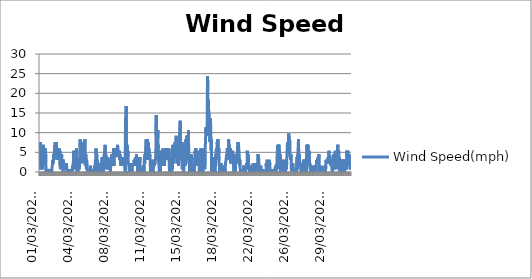
| Category | Wind Speed(mph) |
|---|---|
|  01/03/2022 00:20:09 | 5.4 |
|  01/03/2022 00:50:09 | 7.6 |
|  01/03/2022 01:20:09 | 0.7 |
|  01/03/2022 01:50:09 | 0.7 |
|  01/03/2022 02:20:09 | 3.1 |
|  01/03/2022 02:50:09 | 3.1 |
|  01/03/2022 03:20:09 | 3.8 |
|  01/03/2022 03:50:09 | 0.7 |
|  01/03/2022 04:20:09 | 1.6 |
|  01/03/2022 04:50:09 | 3.1 |
|  01/03/2022 05:20:09 | 3.8 |
|  01/03/2022 05:50:09 | 2.2 |
|  01/03/2022 06:20:09 | 0.7 |
|  01/03/2022 06:50:09 | 3.1 |
|  01/03/2022 07:20:09 | 5.4 |
|  01/03/2022 07:50:09 | 5.4 |
|  01/03/2022 08:20:09 | 6.9 |
|  01/03/2022 08:50:09 | 2.2 |
|  01/03/2022 09:20:09 | 5.4 |
|  01/03/2022 09:50:09 | 4.5 |
|  01/03/2022 10:20:09 | 5.4 |
|  01/03/2022 10:50:09 | 6 |
|  01/03/2022 11:20:09 | 3.8 |
|  01/03/2022 11:50:09 | 6 |
|  01/03/2022 12:20:09 | 3.8 |
|  01/03/2022 12:50:09 | 3.8 |
|  01/03/2022 15:54:06 | 5.4 |
|  01/03/2022 16:24:06 | 2.2 |
|  01/03/2022 16:54:06 | 0.7 |
|  01/03/2022 17:24:06 | 0 |
|  01/03/2022 17:54:06 | 0.7 |
|  01/03/2022 18:24:06 | 0 |
|  01/03/2022 18:54:06 | 0 |
|  01/03/2022 19:24:06 | 0 |
|  01/03/2022 19:54:06 | 0 |
|  01/03/2022 20:24:06 | 0 |
|  01/03/2022 20:54:06 | 0 |
|  01/03/2022 21:24:06 | 0 |
|  01/03/2022 21:54:06 | 0 |
|  01/03/2022 22:24:06 | 0 |
|  01/03/2022 22:54:06 | 0 |
|  01/03/2022 23:24:06 | 0.7 |
|  01/03/2022 23:54:06 | 0 |
|  02/03/2022 00:24:06 | 0 |
|  02/03/2022 00:54:06 | 0 |
|  02/03/2022 01:24:06 | 0 |
|  02/03/2022 01:54:06 | 0 |
|  02/03/2022 02:24:06 | 0.7 |
|  02/03/2022 02:54:06 | 0 |
|  02/03/2022 03:24:06 | 0 |
|  02/03/2022 03:54:06 | 0 |
|  02/03/2022 04:24:06 | 0 |
|  02/03/2022 04:54:06 | 0 |
|  02/03/2022 05:24:06 | 0.7 |
|  02/03/2022 05:54:06 | 0 |
|  02/03/2022 06:24:06 | 0 |
|  02/03/2022 06:54:06 | 0.7 |
|  02/03/2022 07:24:06 | 0.7 |
|  02/03/2022 07:54:06 | 1.6 |
|  02/03/2022 08:24:06 | 1.6 |
|  02/03/2022 08:54:06 | 1.6 |
|  02/03/2022 09:24:06 | 3.1 |
|  02/03/2022 09:54:06 | 2.2 |
|  02/03/2022 10:24:06 | 2.2 |
|  02/03/2022 10:54:06 | 2.2 |
|  02/03/2022 11:24:06 | 4.5 |
|  02/03/2022 11:54:06 | 3.1 |
|  02/03/2022 12:24:06 | 4.5 |
|  02/03/2022 12:54:06 | 4.5 |
|  02/03/2022 13:24:06 | 4.5 |
|  02/03/2022 13:54:06 | 6.9 |
|  02/03/2022 14:24:06 | 4.5 |
|  02/03/2022 14:54:06 | 7.6 |
|  02/03/2022 15:24:06 | 6.9 |
|  02/03/2022 15:54:06 | 6 |
|  02/03/2022 16:24:06 | 5.4 |
|  02/03/2022 16:54:06 | 3.8 |
|  02/03/2022 17:24:06 | 7.6 |
|  02/03/2022 17:54:06 | 6 |
|  02/03/2022 18:24:06 | 6 |
|  02/03/2022 18:54:06 | 4.5 |
|  02/03/2022 19:24:06 | 3.8 |
|  02/03/2022 19:54:06 | 6 |
|  02/03/2022 20:24:06 | 4.5 |
|  02/03/2022 20:54:06 | 3.1 |
|  02/03/2022 21:24:06 | 3.1 |
|  02/03/2022 21:54:06 | 3.8 |
|  02/03/2022 22:24:06 | 3.1 |
|  02/03/2022 22:54:06 | 6 |
|  02/03/2022 23:24:06 | 5.4 |
|  02/03/2022 23:54:06 | 6 |
|  03/03/2022 00:24:06 | 4.5 |
|  03/03/2022 00:54:06 | 3.1 |
|  03/03/2022 01:24:06 | 4.5 |
|  03/03/2022 01:54:06 | 5.4 |
|  03/03/2022 02:24:06 | 1.6 |
|  03/03/2022 02:54:06 | 1.6 |
|  03/03/2022 03:24:06 | 0.7 |
|  03/03/2022 03:54:06 | 1.6 |
|  03/03/2022 04:24:06 | 3.1 |
|  03/03/2022 04:54:06 | 1.6 |
|  03/03/2022 05:24:06 | 2.2 |
|  03/03/2022 05:54:06 | 4.5 |
|  03/03/2022 06:24:06 | 3.8 |
|  03/03/2022 06:54:06 | 1.6 |
|  03/03/2022 07:24:06 | 3.1 |
|  03/03/2022 07:54:06 | 1.6 |
|  03/03/2022 08:24:06 | 1.6 |
|  03/03/2022 08:54:06 | 1.6 |
|  03/03/2022 09:24:06 | 0.7 |
|  03/03/2022 09:54:06 | 0 |
|  03/03/2022 10:24:06 | 3.1 |
|  03/03/2022 10:54:06 | 2.2 |
|  03/03/2022 11:24:06 | 1.6 |
|  03/03/2022 11:54:06 | 2.2 |
|  03/03/2022 12:24:06 | 1.6 |
|  03/03/2022 12:54:06 | 0.7 |
|  03/03/2022 13:24:06 | 0.7 |
|  03/03/2022 13:54:06 | 2.2 |
|  03/03/2022 14:24:06 | 2.2 |
|  03/03/2022 14:54:06 | 2.2 |
|  03/03/2022 15:24:06 | 0.7 |
|  03/03/2022 15:54:06 | 1.6 |
|  03/03/2022 16:24:06 | 2.2 |
|  03/03/2022 16:54:06 | 0.7 |
|  03/03/2022 17:24:06 | 2.2 |
|  03/03/2022 17:54:06 | 1.6 |
|  03/03/2022 18:24:06 | 0 |
|  03/03/2022 18:54:06 | 0 |
|  03/03/2022 19:24:06 | 0 |
|  03/03/2022 19:54:06 | 0 |
|  03/03/2022 20:24:06 | 0 |
|  03/03/2022 20:54:06 | 0 |
|  03/03/2022 21:24:06 | 0 |
|  03/03/2022 21:54:06 | 0 |
|  03/03/2022 22:24:06 | 0 |
|  03/03/2022 22:54:06 | 0 |
|  03/03/2022 23:24:06 | 0 |
|  03/03/2022 23:54:06 | 0 |
|  04/03/2022 00:24:06 | 0 |
|  04/03/2022 00:54:06 | 0.7 |
|  04/03/2022 01:24:06 | 0.7 |
|  04/03/2022 01:54:06 | 0.7 |
|  04/03/2022 02:24:06 | 0 |
|  04/03/2022 02:54:06 | 0 |
|  04/03/2022 03:24:06 | 0 |
|  04/03/2022 03:54:06 | 0 |
|  04/03/2022 04:24:06 | 0.7 |
|  04/03/2022 04:54:06 | 0 |
|  04/03/2022 05:24:06 | 0 |
|  04/03/2022 05:54:06 | 0 |
|  04/03/2022 06:24:06 | 0 |
|  04/03/2022 06:54:06 | 0 |
|  04/03/2022 07:24:06 | 0.7 |
|  04/03/2022 07:54:06 | 0 |
|  04/03/2022 08:24:06 | 1.6 |
|  04/03/2022 08:54:06 | 0.7 |
|  04/03/2022 09:24:06 | 0.7 |
|  04/03/2022 09:54:06 | 2.2 |
|  04/03/2022 10:24:06 | 5.4 |
|  04/03/2022 10:54:06 | 5.4 |
|  04/03/2022 11:24:06 | 4.5 |
|  04/03/2022 11:54:06 | 3.8 |
|  04/03/2022 12:24:06 | 4.5 |
|  04/03/2022 12:54:06 | 1.6 |
|  04/03/2022 13:24:06 | 4.5 |
|  04/03/2022 13:54:06 | 3.1 |
|  04/03/2022 14:24:06 | 0.7 |
|  04/03/2022 14:54:06 | 0.7 |
|  04/03/2022 15:24:06 | 3.8 |
|  04/03/2022 15:54:06 | 5.4 |
|  04/03/2022 16:24:06 | 3.1 |
|  04/03/2022 16:54:06 | 1.6 |
|  04/03/2022 17:24:06 | 6 |
|  04/03/2022 17:54:06 | 0.7 |
|  04/03/2022 18:24:06 | 1.6 |
|  04/03/2022 18:54:06 | 0 |
|  04/03/2022 19:24:06 | 0 |
|  04/03/2022 19:54:06 | 0 |
|  04/03/2022 20:24:06 | 0 |
|  04/03/2022 20:54:06 | 0 |
|  04/03/2022 21:24:06 | 0 |
|  04/03/2022 21:54:06 | 0 |
|  04/03/2022 22:24:06 | 3.8 |
|  04/03/2022 22:54:06 | 1.6 |
|  04/03/2022 23:24:06 | 3.1 |
|  04/03/2022 23:54:06 | 0.7 |
|  05/03/2022 00:24:06 | 0.7 |
|  05/03/2022 00:54:06 | 2.2 |
|  05/03/2022 01:24:06 | 5.4 |
|  05/03/2022 01:54:06 | 6.9 |
|  05/03/2022 02:24:06 | 8.3 |
|  05/03/2022 02:54:06 | 3.8 |
|  05/03/2022 03:24:06 | 3.8 |
|  05/03/2022 03:54:06 | 3.8 |
|  05/03/2022 04:24:06 | 3.8 |
|  05/03/2022 04:54:06 | 6.9 |
|  05/03/2022 05:24:06 | 5.4 |
|  05/03/2022 05:54:06 | 6 |
|  05/03/2022 06:24:06 | 3.1 |
|  05/03/2022 06:54:06 | 2.2 |
|  05/03/2022 07:24:06 | 3.8 |
|  05/03/2022 07:54:06 | 3.1 |
|  05/03/2022 08:24:06 | 7.6 |
|  05/03/2022 08:54:06 | 6.9 |
|  05/03/2022 09:24:06 | 6 |
|  05/03/2022 09:54:06 | 6 |
|  05/03/2022 10:24:06 | 3.8 |
|  05/03/2022 10:54:06 | 6.9 |
|  05/03/2022 11:24:06 | 3.1 |
|  05/03/2022 11:54:06 | 7.6 |
|  05/03/2022 12:24:06 | 6.9 |
|  05/03/2022 12:54:06 | 7.6 |
|  05/03/2022 13:24:06 | 8.3 |
|  05/03/2022 13:54:06 | 3.8 |
|  05/03/2022 14:24:06 | 1.6 |
|  05/03/2022 14:54:06 | 2.2 |
|  05/03/2022 15:24:06 | 4.5 |
|  05/03/2022 15:54:06 | 3.1 |
|  05/03/2022 16:24:06 | 2.2 |
|  05/03/2022 16:54:06 | 0.7 |
|  05/03/2022 17:24:06 | 3.1 |
|  05/03/2022 17:54:06 | 3.1 |
|  05/03/2022 18:24:06 | 1.6 |
|  05/03/2022 18:54:06 | 0.7 |
|  05/03/2022 19:24:06 | 0.7 |
|  05/03/2022 19:54:06 | 0 |
|  05/03/2022 20:24:06 | 0 |
|  05/03/2022 20:54:06 | 0 |
|  05/03/2022 21:24:06 | 0.7 |
|  05/03/2022 21:54:06 | 0 |
|  05/03/2022 22:24:06 | 0.7 |
|  05/03/2022 22:54:06 | 0.7 |
|  05/03/2022 23:24:06 | 0 |
|  05/03/2022 23:54:06 | 0.7 |
|  06/03/2022 00:24:06 | 0.7 |
|  06/03/2022 00:54:06 | 0 |
|  06/03/2022 01:24:06 | 0.7 |
|  06/03/2022 01:54:06 | 0 |
|  06/03/2022 02:24:06 | 1.6 |
|  06/03/2022 02:54:06 | 0.7 |
|  06/03/2022 03:24:06 | 0 |
|  06/03/2022 03:54:06 | 0 |
|  06/03/2022 04:24:06 | 0 |
|  06/03/2022 04:54:06 | 0 |
|  06/03/2022 05:24:06 | 0 |
|  06/03/2022 05:54:06 | 0 |
|  06/03/2022 06:24:06 | 0 |
|  06/03/2022 06:54:06 | 0 |
|  06/03/2022 07:24:06 | 0 |
|  06/03/2022 07:54:06 | 0 |
|  06/03/2022 08:24:06 | 0.7 |
|  06/03/2022 08:54:06 | 0 |
|  06/03/2022 09:24:06 | 0 |
|  06/03/2022 09:54:06 | 0 |
|  06/03/2022 10:24:06 | 0 |
|  06/03/2022 10:54:06 | 0 |
|  06/03/2022 11:24:06 | 0.7 |
|  06/03/2022 11:54:06 | 1.6 |
|  06/03/2022 12:24:06 | 0 |
|  06/03/2022 12:54:06 | 0.7 |
|  06/03/2022 13:24:06 | 0.7 |
|  06/03/2022 13:54:06 | 1.6 |
|  06/03/2022 14:24:06 | 3.1 |
|  06/03/2022 14:54:06 | 0 |
|  06/03/2022 15:24:06 | 0.7 |
|  06/03/2022 15:54:06 | 6 |
|  06/03/2022 16:24:06 | 2.2 |
|  06/03/2022 16:54:06 | 3.1 |
|  06/03/2022 17:24:06 | 4.5 |
|  06/03/2022 17:54:06 | 1.6 |
|  06/03/2022 18:24:06 | 3.1 |
|  06/03/2022 18:54:06 | 0.7 |
|  06/03/2022 19:24:06 | 1.6 |
|  06/03/2022 19:54:06 | 0 |
|  06/03/2022 20:24:06 | 0 |
|  06/03/2022 20:54:06 | 0.7 |
|  06/03/2022 21:24:06 | 0 |
|  06/03/2022 21:54:06 | 0 |
|  06/03/2022 22:24:06 | 0 |
|  06/03/2022 22:54:06 | 0 |
|  06/03/2022 23:24:06 | 0 |
|  06/03/2022 23:54:06 | 0.7 |
|  07/03/2022 00:24:06 | 1.6 |
|  07/03/2022 00:54:06 | 0.7 |
|  07/03/2022 01:24:06 | 1.6 |
|  07/03/2022 01:54:06 | 0.7 |
|  07/03/2022 02:24:06 | 0.7 |
|  07/03/2022 02:54:06 | 2.2 |
|  07/03/2022 03:24:06 | 0.7 |
|  07/03/2022 03:54:06 | 0 |
|  07/03/2022 04:24:06 | 2.2 |
|  07/03/2022 04:54:06 | 2.2 |
|  07/03/2022 05:24:06 | 3.1 |
|  07/03/2022 05:54:06 | 3.1 |
|  07/03/2022 06:24:06 | 3.8 |
|  07/03/2022 06:54:06 | 1.6 |
|  07/03/2022 07:24:06 | 0 |
|  07/03/2022 07:54:06 | 1.6 |
|  07/03/2022 08:24:06 | 0 |
|  07/03/2022 08:54:06 | 1.6 |
|  07/03/2022 09:24:06 | 2.2 |
|  07/03/2022 09:54:06 | 1.6 |
|  07/03/2022 10:24:06 | 2.2 |
|  07/03/2022 10:54:06 | 3.1 |
|  07/03/2022 11:24:06 | 4.5 |
|  07/03/2022 11:54:06 | 2.2 |
|  07/03/2022 12:24:06 | 5.4 |
|  07/03/2022 12:54:06 | 5.4 |
|  07/03/2022 13:24:06 | 6.9 |
|  07/03/2022 13:54:06 | 4.5 |
|  07/03/2022 14:24:06 | 1.6 |
|  07/03/2022 14:54:06 | 4.5 |
|  07/03/2022 15:24:06 | 3.8 |
|  07/03/2022 15:54:06 | 2.2 |
|  07/03/2022 16:24:06 | 3.8 |
|  07/03/2022 16:54:06 | 2.2 |
|  07/03/2022 17:24:06 | 0.7 |
|  07/03/2022 17:54:06 | 1.6 |
|  07/03/2022 18:24:06 | 2.2 |
|  07/03/2022 18:54:06 | 0.7 |
|  07/03/2022 19:24:06 | 2.2 |
|  07/03/2022 19:54:06 | 3.8 |
|  07/03/2022 20:24:06 | 2.2 |
|  07/03/2022 20:54:06 | 1.6 |
|  07/03/2022 21:24:06 | 2.2 |
|  07/03/2022 21:54:06 | 2.2 |
|  07/03/2022 22:24:06 | 1.6 |
|  07/03/2022 22:54:06 | 2.2 |
|  07/03/2022 23:24:06 | 1.6 |
|  07/03/2022 23:54:06 | 2.2 |
|  08/03/2022 00:24:06 | 2.2 |
|  08/03/2022 00:54:06 | 1.6 |
|  08/03/2022 01:24:06 | 0.7 |
|  08/03/2022 01:54:06 | 0 |
|  08/03/2022 02:24:06 | 0.7 |
|  08/03/2022 02:54:06 | 1.6 |
|  08/03/2022 03:24:06 | 3.1 |
|  08/03/2022 03:54:06 | 2.2 |
|  08/03/2022 04:24:06 | 2.2 |
|  08/03/2022 04:54:06 | 3.8 |
|  08/03/2022 05:24:06 | 4.5 |
|  08/03/2022 05:54:06 | 3.8 |
|  08/03/2022 06:24:06 | 3.1 |
|  08/03/2022 06:54:06 | 3.8 |
|  08/03/2022 07:24:06 | 1.6 |
|  08/03/2022 07:54:06 | 3.1 |
|  08/03/2022 08:24:06 | 3.1 |
|  08/03/2022 08:54:06 | 4.5 |
|  08/03/2022 09:24:06 | 6 |
|  08/03/2022 09:54:06 | 4.5 |
|  08/03/2022 10:24:06 | 1.6 |
|  08/03/2022 10:54:06 | 2.2 |
|  08/03/2022 11:24:06 | 6 |
|  08/03/2022 11:54:06 | 4.5 |
|  08/03/2022 12:24:06 | 6 |
|  08/03/2022 12:54:06 | 3.8 |
|  08/03/2022 13:24:06 | 4.5 |
|  08/03/2022 13:54:06 | 3.8 |
|  08/03/2022 14:24:06 | 4.5 |
|  08/03/2022 14:54:06 | 6 |
|  08/03/2022 15:24:06 | 5.4 |
|  08/03/2022 15:54:06 | 3.8 |
|  08/03/2022 16:24:06 | 6 |
|  08/03/2022 16:54:06 | 4.5 |
|  08/03/2022 17:24:06 | 4.5 |
|  08/03/2022 17:54:06 | 5.4 |
|  08/03/2022 18:24:06 | 5.4 |
|  08/03/2022 18:54:06 | 6.9 |
|  08/03/2022 19:24:06 | 6.9 |
|  08/03/2022 19:54:06 | 5.4 |
|  08/03/2022 20:24:06 | 5.4 |
|  08/03/2022 20:54:06 | 4.5 |
|  08/03/2022 21:24:06 | 5.4 |
|  08/03/2022 21:54:06 | 5.4 |
|  08/03/2022 22:24:06 | 3.8 |
|  08/03/2022 22:54:06 | 5.4 |
|  08/03/2022 23:24:06 | 4.5 |
|  08/03/2022 23:54:06 | 3.1 |
|  09/03/2022 00:24:06 | 4.5 |
|  09/03/2022 00:54:06 | 4.5 |
|  09/03/2022 01:24:06 | 3.1 |
|  09/03/2022 01:54:06 | 2.2 |
|  09/03/2022 02:24:06 | 2.2 |
|  09/03/2022 02:54:06 | 1.6 |
|  09/03/2022 03:24:06 | 1.6 |
|  09/03/2022 03:54:06 | 1.6 |
|  09/03/2022 04:24:06 | 3.1 |
|  09/03/2022 04:54:06 | 2.2 |
|  09/03/2022 05:24:06 | 3.8 |
|  09/03/2022 05:54:06 | 2.2 |
|  09/03/2022 06:24:06 | 3.8 |
|  09/03/2022 06:54:06 | 3.1 |
|  09/03/2022 07:24:06 | 2.2 |
|  09/03/2022 07:54:06 | 1.6 |
|  09/03/2022 08:24:06 | 2.2 |
|  09/03/2022 08:54:06 | 3.1 |
|  09/03/2022 09:24:06 | 1.6 |
|  09/03/2022 09:54:06 | 1.6 |
|  09/03/2022 10:24:06 | 1.6 |
|  09/03/2022 10:54:06 | 2.2 |
|  09/03/2022 11:24:06 | 2.2 |
|  09/03/2022 11:54:06 | 1.6 |
|  09/03/2022 12:24:06 | 1.6 |
|  09/03/2022 12:54:06 | 1.6 |
|  09/03/2022 13:24:06 | 0 |
|  09/03/2022 13:54:06 | 13.6 |
|  09/03/2022 14:24:06 | 3.8 |
|  09/03/2022 14:54:06 | 13.6 |
|  09/03/2022 15:24:06 | 16.8 |
|  09/03/2022 15:54:06 | 9.2 |
|  09/03/2022 16:24:06 | 6 |
|  09/03/2022 16:54:06 | 3.1 |
|  09/03/2022 17:24:06 | 5.4 |
|  09/03/2022 17:54:06 | 6.9 |
|  09/03/2022 18:24:06 | 4.5 |
|  09/03/2022 18:54:06 | 4.5 |
|  09/03/2022 19:24:06 | 5.4 |
|  09/03/2022 19:54:06 | 3.8 |
|  09/03/2022 20:24:06 | 2.2 |
|  09/03/2022 20:54:06 | 2.2 |
|  09/03/2022 21:24:06 | 2.2 |
|  09/03/2022 21:54:06 | 1.6 |
|  09/03/2022 22:24:06 | 1.6 |
|  09/03/2022 22:54:06 | 0 |
|  09/03/2022 23:24:06 | 0.7 |
|  09/03/2022 23:54:06 | 0.7 |
|  10/03/2022 00:24:06 | 0.7 |
|  10/03/2022 00:54:06 | 0.7 |
|  10/03/2022 01:24:06 | 0.7 |
|  10/03/2022 01:54:06 | 2.2 |
|  10/03/2022 02:24:06 | 1.6 |
|  10/03/2022 02:54:06 | 1.6 |
|  10/03/2022 03:24:06 | 0.7 |
|  10/03/2022 03:54:06 | 0.7 |
|  10/03/2022 04:24:06 | 1.6 |
|  10/03/2022 04:54:06 | 0 |
|  10/03/2022 05:24:06 | 0.7 |
|  10/03/2022 05:54:06 | 1.6 |
|  10/03/2022 06:24:06 | 1.6 |
|  10/03/2022 06:54:06 | 2.2 |
|  10/03/2022 07:24:06 | 2.2 |
|  10/03/2022 07:54:06 | 2.2 |
|  10/03/2022 08:24:06 | 1.6 |
|  10/03/2022 08:54:06 | 1.6 |
|  10/03/2022 09:24:06 | 1.6 |
|  10/03/2022 09:54:06 | 2.2 |
|  10/03/2022 10:24:06 | 3.1 |
|  10/03/2022 10:54:06 | 1.6 |
|  10/03/2022 11:24:06 | 1.6 |
|  10/03/2022 11:54:06 | 3.1 |
|  10/03/2022 12:24:06 | 1.6 |
|  10/03/2022 12:54:06 | 2.2 |
|  10/03/2022 13:24:06 | 3.8 |
|  10/03/2022 13:54:06 | 3.1 |
|  10/03/2022 14:24:06 | 2.2 |
|  10/03/2022 14:54:06 | 3.1 |
|  10/03/2022 15:24:06 | 2.2 |
|  10/03/2022 15:54:06 | 4.5 |
|  10/03/2022 16:24:06 | 3.1 |
|  10/03/2022 16:54:06 | 2.2 |
|  10/03/2022 17:24:06 | 2.2 |
|  10/03/2022 17:54:06 | 1.6 |
|  10/03/2022 18:24:06 | 2.2 |
|  10/03/2022 18:54:06 | 2.2 |
|  10/03/2022 19:24:06 | 0 |
|  10/03/2022 19:54:06 | 2.2 |
|  10/03/2022 20:24:06 | 0 |
|  10/03/2022 20:54:06 | 3.1 |
|  10/03/2022 21:24:06 | 0.7 |
|  10/03/2022 21:54:06 | 3.8 |
|  10/03/2022 22:24:06 | 3.1 |
|  10/03/2022 22:54:06 | 1.6 |
|  10/03/2022 23:24:06 | 2.2 |
|  10/03/2022 23:54:06 | 3.8 |
|  11/03/2022 00:24:06 | 3.1 |
|  11/03/2022 00:54:06 | 0 |
|  11/03/2022 01:24:06 | 0 |
|  11/03/2022 01:54:06 | 0 |
|  11/03/2022 02:24:06 | 0 |
|  11/03/2022 02:54:06 | 0 |
|  11/03/2022 03:24:06 | 0 |
|  11/03/2022 03:54:06 | 0.7 |
|  11/03/2022 04:24:06 | 0.7 |
|  11/03/2022 04:54:06 | 0 |
|  11/03/2022 05:24:06 | 0.7 |
|  11/03/2022 05:54:06 | 0.7 |
|  11/03/2022 06:24:06 | 0.7 |
|  11/03/2022 06:54:06 | 0 |
|  11/03/2022 07:24:06 | 0.7 |
|  11/03/2022 07:54:06 | 0.7 |
|  11/03/2022 08:24:06 | 1.6 |
|  11/03/2022 08:54:06 | 1.6 |
|  11/03/2022 09:24:06 | 0 |
|  11/03/2022 09:54:06 | 1.6 |
|  11/03/2022 10:24:06 | 2.2 |
|  11/03/2022 10:54:06 | 3.8 |
|  11/03/2022 11:24:06 | 2.2 |
|  11/03/2022 11:54:06 | 2.2 |
|  11/03/2022 12:24:06 | 4.5 |
|  11/03/2022 12:54:06 | 3.8 |
|  11/03/2022 13:24:06 | 3.1 |
|  11/03/2022 13:54:06 | 6 |
|  11/03/2022 14:24:06 | 6.9 |
|  11/03/2022 14:54:06 | 8.3 |
|  11/03/2022 15:24:06 | 6 |
|  11/03/2022 15:54:06 | 4.5 |
|  11/03/2022 16:24:06 | 6 |
|  11/03/2022 16:54:06 | 7.6 |
|  11/03/2022 17:24:06 | 4.5 |
|  11/03/2022 17:54:06 | 8.3 |
|  11/03/2022 18:24:06 | 7.6 |
|  11/03/2022 18:54:06 | 6 |
|  11/03/2022 19:24:06 | 4.5 |
|  11/03/2022 19:54:06 | 3.8 |
|  11/03/2022 20:24:06 | 7.6 |
|  11/03/2022 20:54:06 | 3.1 |
|  11/03/2022 21:24:06 | 6 |
|  11/03/2022 21:54:06 | 3.8 |
|  11/03/2022 22:24:06 | 4.5 |
|  11/03/2022 22:54:06 | 3.1 |
|  11/03/2022 23:24:06 | 4.5 |
|  11/03/2022 23:54:06 | 3.8 |
|  12/03/2022 00:24:06 | 3.1 |
|  12/03/2022 00:54:06 | 3.1 |
|  12/03/2022 01:24:06 | 0 |
|  12/03/2022 01:54:06 | 1.6 |
|  12/03/2022 02:24:06 | 0.7 |
|  12/03/2022 02:54:06 | 2.2 |
|  12/03/2022 03:24:06 | 3.1 |
|  12/03/2022 03:54:06 | 0.7 |
|  12/03/2022 04:24:06 | 0.7 |
|  12/03/2022 04:54:06 | 1.6 |
|  12/03/2022 05:24:06 | 0.7 |
|  12/03/2022 05:54:06 | 0 |
|  12/03/2022 06:24:06 | 0.7 |
|  12/03/2022 06:54:06 | 0 |
|  12/03/2022 07:24:06 | 0.7 |
|  12/03/2022 07:54:06 | 0.7 |
|  12/03/2022 08:24:06 | 3.1 |
|  12/03/2022 08:54:06 | 2.2 |
|  12/03/2022 09:24:06 | 2.2 |
|  12/03/2022 09:54:06 | 1.6 |
|  12/03/2022 10:24:06 | 1.6 |
|  12/03/2022 10:54:06 | 1.6 |
|  12/03/2022 11:24:06 | 1.6 |
|  12/03/2022 11:54:06 | 1.6 |
|  12/03/2022 12:24:06 | 2.2 |
|  12/03/2022 12:54:06 | 2.2 |
|  12/03/2022 13:24:06 | 3.8 |
|  12/03/2022 13:54:06 | 4.5 |
|  12/03/2022 14:24:06 | 9.2 |
|  12/03/2022 14:54:06 | 14.5 |
|  12/03/2022 15:24:06 | 6.9 |
|  12/03/2022 15:54:06 | 9.2 |
|  12/03/2022 16:24:06 | 8.3 |
|  12/03/2022 16:54:06 | 7.6 |
|  12/03/2022 17:24:06 | 7.6 |
|  12/03/2022 17:54:06 | 5.4 |
|  12/03/2022 18:24:06 | 10.7 |
|  12/03/2022 18:54:06 | 6 |
|  12/03/2022 19:24:06 | 6.9 |
|  12/03/2022 19:54:06 | 6 |
|  12/03/2022 20:24:06 | 3.1 |
|  12/03/2022 20:54:06 | 2.2 |
|  12/03/2022 21:24:06 | 1.6 |
|  12/03/2022 21:54:06 | 1.6 |
|  12/03/2022 22:24:06 | 0 |
|  12/03/2022 22:54:06 | 0 |
|  12/03/2022 23:24:06 | 0.7 |
|  12/03/2022 23:54:06 | 0 |
|  13/03/2022 00:24:06 | 1.6 |
|  13/03/2022 00:54:06 | 0 |
|  13/03/2022 01:24:06 | 3.1 |
|  13/03/2022 01:54:06 | 3.1 |
|  13/03/2022 02:24:06 | 1.6 |
|  13/03/2022 02:54:06 | 5.4 |
|  13/03/2022 03:24:06 | 3.8 |
|  13/03/2022 03:54:06 | 3.1 |
|  13/03/2022 04:24:06 | 4.5 |
|  13/03/2022 04:54:06 | 4.5 |
|  13/03/2022 05:24:06 | 3.1 |
|  13/03/2022 05:54:06 | 4.5 |
|  13/03/2022 06:24:06 | 4.5 |
|  13/03/2022 06:54:06 | 6 |
|  13/03/2022 07:24:06 | 4.5 |
|  13/03/2022 07:54:06 | 3.8 |
|  13/03/2022 08:24:06 | 3.1 |
|  13/03/2022 08:54:06 | 1.6 |
|  13/03/2022 09:24:06 | 3.1 |
|  13/03/2022 09:54:06 | 1.6 |
|  13/03/2022 10:24:06 | 2.2 |
|  13/03/2022 10:54:06 | 2.2 |
|  13/03/2022 11:24:06 | 3.1 |
|  13/03/2022 11:54:06 | 4.5 |
|  13/03/2022 12:24:06 | 4.5 |
|  13/03/2022 12:54:06 | 6 |
|  13/03/2022 13:24:06 | 3.1 |
|  13/03/2022 13:54:06 | 3.8 |
|  13/03/2022 14:24:06 | 3.8 |
|  13/03/2022 14:54:06 | 6 |
|  13/03/2022 15:24:06 | 4.5 |
|  13/03/2022 15:54:06 | 4.5 |
|  13/03/2022 16:24:06 | 4.5 |
|  13/03/2022 16:54:06 | 4.5 |
|  13/03/2022 17:24:06 | 3.1 |
|  13/03/2022 17:54:06 | 3.1 |
|  13/03/2022 18:24:06 | 3.1 |
|  13/03/2022 18:54:06 | 3.1 |
|  13/03/2022 19:24:06 | 4.5 |
|  13/03/2022 19:54:06 | 4.5 |
|  13/03/2022 20:24:06 | 3.1 |
|  13/03/2022 20:54:06 | 6 |
|  13/03/2022 21:24:06 | 3.1 |
|  13/03/2022 21:54:06 | 1.6 |
|  13/03/2022 22:24:06 | 0 |
|  13/03/2022 22:54:06 | 0 |
|  13/03/2022 23:24:06 | 3.8 |
|  13/03/2022 23:54:06 | 1.6 |
|  14/03/2022 00:24:06 | 3.1 |
|  14/03/2022 00:54:06 | 0.7 |
|  14/03/2022 01:24:06 | 0 |
|  14/03/2022 01:54:06 | 1.6 |
|  14/03/2022 02:24:06 | 0.7 |
|  14/03/2022 02:54:06 | 1.6 |
|  14/03/2022 03:24:06 | 0 |
|  14/03/2022 03:54:06 | 0 |
|  14/03/2022 04:24:06 | 1.6 |
|  14/03/2022 04:54:06 | 0.7 |
|  14/03/2022 05:24:06 | 0.7 |
|  14/03/2022 05:54:06 | 6 |
|  14/03/2022 06:24:06 | 2.2 |
|  14/03/2022 06:54:06 | 6.9 |
|  14/03/2022 07:24:06 | 4.5 |
|  14/03/2022 07:54:06 | 3.8 |
|  14/03/2022 08:24:06 | 3.8 |
|  14/03/2022 08:54:06 | 2.2 |
|  14/03/2022 09:24:06 | 2.2 |
|  14/03/2022 09:54:06 | 2.2 |
|  14/03/2022 10:24:06 | 5.4 |
|  14/03/2022 10:54:06 | 6 |
|  14/03/2022 11:24:06 | 7.6 |
|  14/03/2022 11:54:06 | 3.8 |
|  14/03/2022 12:24:06 | 5.4 |
|  14/03/2022 12:54:06 | 4.5 |
|  14/03/2022 13:24:06 | 7.6 |
|  14/03/2022 13:54:06 | 7.6 |
|  14/03/2022 14:24:06 | 9.2 |
|  14/03/2022 14:54:06 | 7.6 |
|  14/03/2022 15:24:06 | 5.4 |
|  14/03/2022 15:54:06 | 6.9 |
|  14/03/2022 16:24:06 | 4.5 |
|  14/03/2022 16:54:06 | 7.6 |
|  14/03/2022 17:24:06 | 2.2 |
|  14/03/2022 17:54:06 | 4.5 |
|  14/03/2022 18:24:06 | 3.1 |
|  14/03/2022 18:54:06 | 4.5 |
|  14/03/2022 19:24:06 | 2.2 |
|  14/03/2022 19:54:06 | 1.6 |
|  14/03/2022 20:24:06 | 3.1 |
|  14/03/2022 20:54:06 | 3.8 |
|  14/03/2022 21:24:06 | 6.9 |
|  14/03/2022 21:54:06 | 7.6 |
|  14/03/2022 22:24:06 | 5.4 |
|  14/03/2022 22:54:06 | 9.8 |
|  14/03/2022 23:24:06 | 9.2 |
|  14/03/2022 23:54:06 | 13 |
|  15/03/2022 00:24:06 | 5.4 |
|  15/03/2022 00:54:06 | 7.6 |
|  15/03/2022 01:24:06 | 4.5 |
|  15/03/2022 01:54:06 | 6 |
|  15/03/2022 02:24:06 | 5.4 |
|  15/03/2022 02:54:06 | 6.9 |
|  15/03/2022 03:24:06 | 6 |
|  15/03/2022 03:54:06 | 3.1 |
|  15/03/2022 04:24:06 | 7.6 |
|  15/03/2022 04:54:06 | 0.7 |
|  15/03/2022 05:24:06 | 0.7 |
|  15/03/2022 05:54:06 | 1.6 |
|  15/03/2022 06:24:06 | 2.2 |
|  15/03/2022 06:54:06 | 2.2 |
|  15/03/2022 07:24:06 | 2.2 |
|  15/03/2022 07:54:06 | 0 |
|  15/03/2022 08:24:06 | 2.2 |
|  15/03/2022 08:54:06 | 1.6 |
|  15/03/2022 09:24:06 | 2.2 |
|  15/03/2022 09:54:06 | 2.2 |
|  15/03/2022 10:24:06 | 1.6 |
|  15/03/2022 10:54:06 | 2.2 |
|  15/03/2022 11:24:06 | 2.2 |
|  15/03/2022 11:54:06 | 1.6 |
|  15/03/2022 12:24:06 | 5.4 |
|  15/03/2022 12:54:06 | 2.2 |
|  15/03/2022 13:24:06 | 8.3 |
|  15/03/2022 13:54:06 | 8.3 |
|  15/03/2022 14:24:06 | 3.1 |
|  15/03/2022 14:54:06 | 7.6 |
|  15/03/2022 15:24:06 | 9.2 |
|  15/03/2022 15:54:06 | 8.3 |
|  15/03/2022 16:24:06 | 8.3 |
|  15/03/2022 16:54:06 | 9.2 |
|  15/03/2022 17:24:06 | 3.1 |
|  15/03/2022 17:54:06 | 6 |
|  15/03/2022 18:24:06 | 7.6 |
|  15/03/2022 18:54:06 | 4.5 |
|  15/03/2022 19:24:06 | 10.7 |
|  15/03/2022 19:54:06 | 6.9 |
|  15/03/2022 20:24:06 | 3.8 |
|  15/03/2022 20:54:06 | 3.8 |
|  15/03/2022 21:24:06 | 4.5 |
|  15/03/2022 21:54:06 | 0 |
|  15/03/2022 22:24:06 | 3.1 |
|  15/03/2022 22:54:06 | 2.2 |
|  15/03/2022 23:24:06 | 3.8 |
|  15/03/2022 23:54:06 | 3.1 |
|  16/03/2022 00:24:06 | 3.8 |
|  16/03/2022 00:54:06 | 3.8 |
|  16/03/2022 01:24:06 | 3.1 |
|  16/03/2022 01:54:06 | 3.1 |
|  16/03/2022 02:24:06 | 4.5 |
|  16/03/2022 02:54:06 | 3.1 |
|  16/03/2022 03:24:06 | 3.8 |
|  16/03/2022 03:54:06 | 3.1 |
|  16/03/2022 04:24:06 | 1.6 |
|  16/03/2022 04:54:06 | 2.2 |
|  16/03/2022 05:24:06 | 0 |
|  16/03/2022 05:54:06 | 0 |
|  16/03/2022 06:24:06 | 0.7 |
|  16/03/2022 06:54:06 | 0.7 |
|  16/03/2022 07:24:06 | 0 |
|  16/03/2022 07:54:06 | 0 |
|  16/03/2022 08:24:06 | 1.6 |
|  16/03/2022 08:54:06 | 0 |
|  16/03/2022 09:24:06 | 0 |
|  16/03/2022 09:54:06 | 1.6 |
|  16/03/2022 10:24:06 | 1.6 |
|  16/03/2022 10:54:06 | 1.6 |
|  16/03/2022 11:24:06 | 5.4 |
|  16/03/2022 11:54:06 | 5.4 |
|  16/03/2022 12:24:06 | 3.8 |
|  16/03/2022 12:54:06 | 6 |
|  16/03/2022 13:24:06 | 3.8 |
|  16/03/2022 13:54:06 | 2.2 |
|  16/03/2022 14:24:06 | 3.8 |
|  16/03/2022 14:54:06 | 1.6 |
|  16/03/2022 15:24:06 | 1.6 |
|  16/03/2022 15:54:06 | 3.1 |
|  16/03/2022 16:24:06 | 1.6 |
|  16/03/2022 16:54:06 | 3.1 |
|  16/03/2022 17:24:06 | 3.1 |
|  16/03/2022 17:54:06 | 5.4 |
|  16/03/2022 18:24:06 | 1.6 |
|  16/03/2022 18:54:06 | 3.1 |
|  16/03/2022 19:24:06 | 1.6 |
|  16/03/2022 19:54:06 | 2.2 |
|  16/03/2022 20:24:06 | 2.2 |
|  16/03/2022 20:54:06 | 1.6 |
|  16/03/2022 21:24:06 | 0 |
|  16/03/2022 21:54:06 | 0 |
|  16/03/2022 22:24:06 | 0 |
|  16/03/2022 22:54:06 | 0 |
|  16/03/2022 23:24:06 | 3.1 |
|  16/03/2022 23:54:06 | 1.6 |
|  17/03/2022 00:24:06 | 2.2 |
|  17/03/2022 00:54:06 | 6 |
|  17/03/2022 01:24:06 | 6 |
|  17/03/2022 01:54:06 | 6 |
|  17/03/2022 02:24:06 | 6 |
|  17/03/2022 02:54:06 | 3.8 |
|  17/03/2022 03:24:06 | 6 |
|  17/03/2022 03:54:06 | 6 |
|  17/03/2022 04:24:06 | 3.8 |
|  17/03/2022 04:54:06 | 3.8 |
|  17/03/2022 05:24:06 | 0 |
|  17/03/2022 05:54:06 | 2.2 |
|  17/03/2022 06:24:06 | 2.2 |
|  17/03/2022 06:54:06 | 2.2 |
|  17/03/2022 07:24:06 | 2.2 |
|  17/03/2022 07:54:06 | 2.2 |
|  17/03/2022 08:24:06 | 5.4 |
|  17/03/2022 08:54:06 | 4.5 |
|  17/03/2022 09:24:06 | 1.6 |
|  17/03/2022 09:54:06 | 1.6 |
|  17/03/2022 10:24:06 | 0.7 |
|  17/03/2022 10:54:06 | 5.4 |
|  17/03/2022 11:24:06 | 5.4 |
|  17/03/2022 11:54:06 | 7.6 |
|  17/03/2022 12:24:06 | 9.2 |
|  17/03/2022 12:54:06 | 11.4 |
|  17/03/2022 13:24:06 | 9.8 |
|  17/03/2022 13:54:06 | 9.8 |
|  17/03/2022 14:24:06 | 11.4 |
|  17/03/2022 14:54:06 | 9.2 |
|  17/03/2022 15:24:06 | 9.8 |
|  17/03/2022 15:54:06 | 10.7 |
|  17/03/2022 16:24:06 | 21.3 |
|  17/03/2022 16:54:06 | 24.4 |
|  17/03/2022 17:24:06 | 20.6 |
|  17/03/2022 17:54:06 | 16.8 |
|  17/03/2022 18:24:06 | 18.3 |
|  17/03/2022 18:54:06 | 16.8 |
|  17/03/2022 19:24:06 | 15.9 |
|  17/03/2022 19:54:06 | 15.9 |
|  17/03/2022 20:24:06 | 15.9 |
|  17/03/2022 20:54:06 | 14.5 |
|  17/03/2022 21:24:06 | 11.4 |
|  17/03/2022 21:54:06 | 9.2 |
|  17/03/2022 22:24:06 | 7.6 |
|  17/03/2022 22:54:06 | 13 |
|  17/03/2022 23:24:06 | 13.6 |
|  17/03/2022 23:54:06 | 13 |
|  18/03/2022 00:24:06 | 11.4 |
|  18/03/2022 00:54:06 | 8.3 |
|  18/03/2022 01:24:06 | 5.4 |
|  18/03/2022 01:54:06 | 8.3 |
|  18/03/2022 02:24:06 | 0.7 |
|  18/03/2022 02:54:06 | 0 |
|  18/03/2022 03:24:06 | 0.7 |
|  18/03/2022 03:54:06 | 0.7 |
|  18/03/2022 04:24:06 | 0 |
|  18/03/2022 04:54:06 | 3.1 |
|  18/03/2022 05:24:06 | 0.7 |
|  18/03/2022 05:54:06 | 0.7 |
|  18/03/2022 06:24:06 | 0 |
|  18/03/2022 06:54:06 | 0 |
|  18/03/2022 07:24:06 | 0 |
|  18/03/2022 07:54:06 | 2.2 |
|  18/03/2022 08:24:06 | 1.6 |
|  18/03/2022 08:54:06 | 3.8 |
|  18/03/2022 09:24:06 | 2.2 |
|  18/03/2022 09:54:06 | 1.6 |
|  18/03/2022 10:24:06 | 0 |
|  18/03/2022 10:54:06 | 0.7 |
|  18/03/2022 11:24:06 | 0.7 |
|  18/03/2022 11:54:06 | 1.6 |
|  18/03/2022 12:24:06 | 2.2 |
|  18/03/2022 12:54:06 | 4.5 |
|  18/03/2022 13:24:06 | 3.1 |
|  18/03/2022 13:54:06 | 6 |
|  18/03/2022 14:24:06 | 5.4 |
|  18/03/2022 14:54:06 | 6 |
|  18/03/2022 15:24:06 | 4.5 |
|  18/03/2022 15:54:06 | 7.6 |
|  18/03/2022 16:24:06 | 6.9 |
|  18/03/2022 16:54:06 | 5.4 |
|  18/03/2022 17:24:06 | 8.3 |
|  18/03/2022 17:54:06 | 4.5 |
|  18/03/2022 18:24:06 | 6 |
|  18/03/2022 18:54:06 | 3.8 |
|  18/03/2022 19:24:06 | 6 |
|  18/03/2022 19:54:06 | 3.1 |
|  18/03/2022 20:24:06 | 3.1 |
|  18/03/2022 20:54:06 | 1.6 |
|  18/03/2022 21:24:06 | 0.7 |
|  18/03/2022 21:54:06 | 0 |
|  18/03/2022 22:24:06 | 1.6 |
|  18/03/2022 22:54:06 | 0 |
|  18/03/2022 23:24:06 | 0.7 |
|  18/03/2022 23:54:06 | 1.6 |
|  19/03/2022 00:24:06 | 0 |
|  19/03/2022 00:54:06 | 0 |
|  19/03/2022 01:24:06 | 2.2 |
|  19/03/2022 01:54:06 | 0 |
|  19/03/2022 02:24:06 | 0.7 |
|  19/03/2022 02:54:06 | 0 |
|  19/03/2022 03:24:06 | 0 |
|  19/03/2022 03:54:06 | 0 |
|  19/03/2022 04:24:06 | 0 |
|  19/03/2022 04:54:06 | 0.7 |
|  19/03/2022 05:24:06 | 0 |
|  19/03/2022 05:54:06 | 0 |
|  19/03/2022 06:24:06 | 0.7 |
|  19/03/2022 06:54:06 | 0 |
|  19/03/2022 07:24:06 | 0 |
|  19/03/2022 07:54:06 | 0 |
|  19/03/2022 08:24:06 | 0 |
|  19/03/2022 08:54:06 | 1.6 |
|  19/03/2022 09:24:06 | 1.6 |
|  19/03/2022 09:54:06 | 0 |
|  19/03/2022 10:24:06 | 0 |
|  19/03/2022 10:54:06 | 0.7 |
|  19/03/2022 11:24:06 | 2.2 |
|  19/03/2022 11:54:06 | 2.2 |
|  19/03/2022 12:24:06 | 2.2 |
|  19/03/2022 12:54:06 | 3.1 |
|  19/03/2022 13:24:06 | 3.8 |
|  19/03/2022 13:54:06 | 3.8 |
|  19/03/2022 14:24:06 | 4.5 |
|  19/03/2022 14:54:06 | 3.8 |
|  19/03/2022 15:24:06 | 3.1 |
|  19/03/2022 15:54:06 | 6 |
|  19/03/2022 16:24:06 | 4.5 |
|  19/03/2022 16:54:06 | 4.5 |
|  19/03/2022 17:24:06 | 3.8 |
|  19/03/2022 17:54:06 | 3.1 |
|  19/03/2022 18:24:06 | 4.5 |
|  19/03/2022 18:54:06 | 8.3 |
|  19/03/2022 19:24:06 | 6.9 |
|  19/03/2022 19:54:06 | 6 |
|  19/03/2022 20:24:06 | 6.9 |
|  19/03/2022 20:54:06 | 5.4 |
|  19/03/2022 21:24:06 | 6 |
|  19/03/2022 21:54:06 | 6 |
|  19/03/2022 22:24:06 | 3.8 |
|  19/03/2022 22:54:06 | 6 |
|  19/03/2022 23:24:06 | 2.2 |
|  19/03/2022 23:54:06 | 3.1 |
|  20/03/2022 00:24:06 | 4.5 |
|  20/03/2022 00:54:06 | 3.8 |
|  20/03/2022 01:24:06 | 3.8 |
|  20/03/2022 01:54:06 | 4.5 |
|  20/03/2022 02:24:06 | 3.8 |
|  20/03/2022 02:54:06 | 2.2 |
|  20/03/2022 03:24:06 | 3.1 |
|  20/03/2022 03:54:06 | 3.8 |
|  20/03/2022 04:24:06 | 5.4 |
|  20/03/2022 04:54:06 | 3.1 |
|  20/03/2022 05:24:06 | 2.2 |
|  20/03/2022 05:54:06 | 3.1 |
|  20/03/2022 06:24:06 | 3.8 |
|  20/03/2022 06:54:06 | 3.1 |
|  20/03/2022 07:24:06 | 0 |
|  20/03/2022 07:54:06 | 3.1 |
|  20/03/2022 08:24:06 | 1.6 |
|  20/03/2022 08:54:06 | 1.6 |
|  20/03/2022 09:24:06 | 0 |
|  20/03/2022 09:54:06 | 1.6 |
|  20/03/2022 10:24:06 | 0.7 |
|  20/03/2022 10:54:06 | 0 |
|  20/03/2022 11:24:06 | 3.1 |
|  20/03/2022 11:54:06 | 4.5 |
|  20/03/2022 12:24:06 | 3.1 |
|  20/03/2022 12:54:06 | 3.1 |
|  20/03/2022 13:24:06 | 2.2 |
|  20/03/2022 13:54:06 | 3.8 |
|  20/03/2022 14:24:06 | 3.1 |
|  20/03/2022 14:54:06 | 3.8 |
|  20/03/2022 15:24:06 | 4.5 |
|  20/03/2022 15:54:06 | 4.5 |
|  20/03/2022 16:24:06 | 6.9 |
|  20/03/2022 16:54:06 | 7.6 |
|  20/03/2022 17:24:06 | 7.6 |
|  20/03/2022 17:54:06 | 7.6 |
|  20/03/2022 18:24:06 | 6.9 |
|  20/03/2022 18:54:06 | 6.9 |
|  20/03/2022 19:24:06 | 6.9 |
|  20/03/2022 19:54:06 | 6.9 |
|  20/03/2022 20:24:06 | 3.8 |
|  20/03/2022 20:54:06 | 1.6 |
|  20/03/2022 21:24:06 | 3.1 |
|  20/03/2022 21:54:06 | 1.6 |
|  20/03/2022 22:24:06 | 0.7 |
|  20/03/2022 22:54:06 | 0.7 |
|  20/03/2022 23:24:06 | 0 |
|  20/03/2022 23:54:06 | 0.7 |
|  21/03/2022 00:24:06 | 0 |
|  21/03/2022 00:54:06 | 0 |
|  21/03/2022 01:24:06 | 0 |
|  21/03/2022 01:54:06 | 0 |
|  21/03/2022 02:24:06 | 0 |
|  21/03/2022 02:54:06 | 0 |
|  21/03/2022 03:24:06 | 0 |
|  21/03/2022 03:54:06 | 0 |
|  21/03/2022 04:24:06 | 0 |
|  21/03/2022 04:54:06 | 0 |
|  21/03/2022 05:24:06 | 0 |
|  21/03/2022 05:54:06 | 0 |
|  21/03/2022 06:24:06 | 0 |
|  21/03/2022 06:54:06 | 1.6 |
|  21/03/2022 07:24:06 | 0 |
|  21/03/2022 07:54:06 | 0 |
|  21/03/2022 08:24:06 | 1.6 |
|  21/03/2022 08:54:06 | 0 |
|  21/03/2022 09:24:06 | 0 |
|  21/03/2022 09:54:06 | 0 |
|  21/03/2022 10:24:06 | 0.7 |
|  21/03/2022 10:54:06 | 0 |
|  21/03/2022 11:24:06 | 1.6 |
|  21/03/2022 11:54:06 | 1.6 |
|  21/03/2022 12:24:06 | 0.7 |
|  21/03/2022 12:54:06 | 1.6 |
|  21/03/2022 13:24:06 | 0.7 |
|  21/03/2022 13:54:06 | 2.2 |
|  21/03/2022 14:24:06 | 0.7 |
|  21/03/2022 14:54:06 | 2.2 |
|  21/03/2022 15:24:06 | 5.4 |
|  21/03/2022 15:54:06 | 2.2 |
|  21/03/2022 16:24:06 | 2.2 |
|  21/03/2022 16:54:06 | 2.2 |
|  21/03/2022 17:24:06 | 4.5 |
|  21/03/2022 17:54:06 | 0.7 |
|  21/03/2022 18:24:06 | 2.2 |
|  21/03/2022 18:54:06 | 1.6 |
|  21/03/2022 19:24:06 | 1.6 |
|  21/03/2022 19:54:06 | 0.7 |
|  21/03/2022 20:24:06 | 0.7 |
|  21/03/2022 20:54:06 | 0 |
|  21/03/2022 21:24:06 | 0 |
|  21/03/2022 21:54:06 | 0 |
|  21/03/2022 22:24:06 | 0 |
|  21/03/2022 22:54:06 | 0 |
|  21/03/2022 23:24:06 | 0 |
|  21/03/2022 23:54:06 | 1.6 |
|  22/03/2022 00:24:06 | 0 |
|  22/03/2022 00:54:06 | 0 |
|  22/03/2022 01:24:06 | 0 |
|  22/03/2022 01:54:06 | 0 |
|  22/03/2022 02:24:06 | 0 |
|  22/03/2022 02:54:06 | 0 |
|  22/03/2022 03:24:06 | 0 |
|  22/03/2022 03:54:06 | 0 |
|  22/03/2022 04:24:06 | 0 |
|  22/03/2022 04:54:06 | 0 |
|  22/03/2022 05:25:06 | 2.2 |
|  22/03/2022 05:55:06 | 0 |
|  22/03/2022 06:25:06 | 0 |
|  22/03/2022 06:55:06 | 0.7 |
|  22/03/2022 07:25:06 | 0 |
|  22/03/2022 07:55:06 | 0 |
|  22/03/2022 08:25:06 | 0 |
|  22/03/2022 08:55:06 | 0 |
|  22/03/2022 09:25:06 | 0 |
|  22/03/2022 09:55:06 | 0.7 |
|  22/03/2022 10:25:06 | 0 |
|  22/03/2022 10:55:06 | 0 |
|  22/03/2022 11:25:06 | 0.7 |
|  22/03/2022 11:55:06 | 0 |
|  22/03/2022 12:25:06 | 2.2 |
|  22/03/2022 12:55:06 | 1.6 |
|  22/03/2022 13:25:06 | 2.2 |
|  22/03/2022 13:55:06 | 2.2 |
|  22/03/2022 14:25:06 | 1.6 |
|  22/03/2022 14:55:06 | 0.7 |
|  22/03/2022 15:25:06 | 0.7 |
|  22/03/2022 15:55:06 | 2.2 |
|  22/03/2022 16:25:06 | 2.2 |
|  22/03/2022 16:55:06 | 4.5 |
|  22/03/2022 17:25:06 | 3.1 |
|  22/03/2022 17:55:06 | 3.8 |
|  22/03/2022 18:25:06 | 3.1 |
|  22/03/2022 18:55:06 | 2.2 |
|  22/03/2022 19:25:06 | 2.2 |
|  22/03/2022 19:55:06 | 1.6 |
|  22/03/2022 20:25:06 | 0.7 |
|  22/03/2022 20:55:06 | 0 |
|  22/03/2022 21:25:06 | 0.7 |
|  22/03/2022 21:55:06 | 0 |
|  22/03/2022 22:25:06 | 0 |
|  22/03/2022 22:55:06 | 0 |
|  22/03/2022 23:25:06 | 1.6 |
|  22/03/2022 23:55:06 | 0 |
|  23/03/2022 00:25:06 | 0 |
|  23/03/2022 00:55:06 | 0 |
|  23/03/2022 01:25:06 | 0 |
|  23/03/2022 01:55:06 | 0 |
|  23/03/2022 02:25:06 | 0.7 |
|  23/03/2022 02:55:06 | 0 |
|  23/03/2022 03:25:06 | 0 |
|  23/03/2022 03:55:06 | 0.7 |
|  23/03/2022 04:25:06 | 0 |
|  23/03/2022 04:55:06 | 0 |
|  23/03/2022 05:25:06 | 0 |
|  23/03/2022 05:55:06 | 0 |
|  23/03/2022 06:25:06 | 0 |
|  23/03/2022 06:55:06 | 0 |
|  23/03/2022 07:25:06 | 0 |
|  23/03/2022 07:55:06 | 0 |
|  23/03/2022 08:25:06 | 0 |
|  23/03/2022 08:55:06 | 0 |
|  23/03/2022 09:25:06 | 0 |
|  23/03/2022 09:55:06 | 0 |
|  23/03/2022 10:25:06 | 0 |
|  23/03/2022 10:55:06 | 0 |
|  23/03/2022 11:25:06 | 0 |
|  23/03/2022 11:55:06 | 0 |
|  23/03/2022 12:25:06 | 2.2 |
|  23/03/2022 12:55:06 | 0.7 |
|  23/03/2022 13:25:06 | 0.7 |
|  23/03/2022 13:55:06 | 0.7 |
|  23/03/2022 14:25:06 | 0.7 |
|  23/03/2022 14:55:06 | 3.1 |
|  23/03/2022 15:25:06 | 1.6 |
|  23/03/2022 15:55:06 | 0.7 |
|  23/03/2022 16:25:06 | 0.7 |
|  23/03/2022 16:55:06 | 0.7 |
|  23/03/2022 17:25:06 | 0 |
|  23/03/2022 17:55:06 | 0.7 |
|  23/03/2022 18:25:06 | 1.6 |
|  23/03/2022 18:55:06 | 2.2 |
|  23/03/2022 19:25:06 | 2.2 |
|  23/03/2022 19:55:06 | 3.1 |
|  23/03/2022 20:25:06 | 3.1 |
|  23/03/2022 20:55:06 | 1.6 |
|  23/03/2022 21:25:06 | 0 |
|  23/03/2022 21:55:06 | 0 |
|  23/03/2022 22:25:06 | 0 |
|  23/03/2022 22:55:06 | 0.7 |
|  23/03/2022 23:25:06 | 0 |
|  23/03/2022 23:55:06 | 0 |
|  24/03/2022 00:25:06 | 0.7 |
|  24/03/2022 00:55:06 | 0 |
|  24/03/2022 01:25:06 | 0 |
|  24/03/2022 01:55:06 | 0 |
|  24/03/2022 02:25:06 | 0 |
|  24/03/2022 02:55:06 | 0.7 |
|  24/03/2022 03:25:06 | 0 |
|  24/03/2022 03:55:06 | 0.7 |
|  24/03/2022 04:25:06 | 0 |
|  24/03/2022 04:55:06 | 0.7 |
|  24/03/2022 05:25:06 | 0 |
|  24/03/2022 05:55:06 | 0.7 |
|  24/03/2022 06:25:06 | 0 |
|  24/03/2022 06:55:06 | 0 |
|  24/03/2022 07:25:06 | 0 |
|  24/03/2022 07:55:06 | 0 |
|  24/03/2022 08:25:06 | 0.7 |
|  24/03/2022 08:55:06 | 0 |
|  24/03/2022 09:25:06 | 0 |
|  24/03/2022 09:55:06 | 0 |
|  24/03/2022 10:25:06 | 1.6 |
|  24/03/2022 10:55:06 | 0 |
|  24/03/2022 11:25:06 | 0 |
|  24/03/2022 11:55:06 | 0 |
|  24/03/2022 12:25:06 | 0 |
|  24/03/2022 12:55:06 | 0 |
|  24/03/2022 13:25:06 | 1.6 |
|  24/03/2022 13:55:06 | 3.1 |
|  24/03/2022 14:25:06 | 4.5 |
|  24/03/2022 14:55:06 | 4.5 |
|  24/03/2022 15:25:06 | 6.9 |
|  24/03/2022 15:55:06 | 5.4 |
|  24/03/2022 16:25:06 | 6 |
|  24/03/2022 16:55:06 | 5.4 |
|  24/03/2022 17:25:06 | 6.9 |
|  24/03/2022 17:55:06 | 4.5 |
|  24/03/2022 18:25:06 | 6.9 |
|  24/03/2022 18:55:06 | 4.5 |
|  24/03/2022 19:25:06 | 5.4 |
|  24/03/2022 19:55:06 | 3.1 |
|  24/03/2022 20:25:06 | 0.7 |
|  24/03/2022 20:55:06 | 2.2 |
|  24/03/2022 21:25:06 | 4.5 |
|  24/03/2022 21:55:06 | 4.5 |
|  24/03/2022 22:25:06 | 0 |
|  24/03/2022 22:55:06 | 0.7 |
|  24/03/2022 23:25:06 | 2.2 |
|  24/03/2022 23:55:06 | 0 |
|  25/03/2022 00:25:06 | 0.7 |
|  25/03/2022 00:55:06 | 0 |
|  25/03/2022 01:25:06 | 0 |
|  25/03/2022 01:55:06 | 0 |
|  25/03/2022 02:25:06 | 3.1 |
|  25/03/2022 02:55:06 | 0 |
|  25/03/2022 03:25:06 | 0.7 |
|  25/03/2022 03:55:06 | 0 |
|  25/03/2022 04:25:06 | 0 |
|  25/03/2022 04:55:06 | 0 |
|  25/03/2022 05:25:06 | 0.7 |
|  25/03/2022 05:55:06 | 1.6 |
|  25/03/2022 06:25:06 | 0 |
|  25/03/2022 06:55:06 | 0.7 |
|  25/03/2022 07:25:06 | 0.7 |
|  25/03/2022 07:55:06 | 3.1 |
|  25/03/2022 08:25:06 | 0 |
|  25/03/2022 08:55:06 | 1.6 |
|  25/03/2022 09:25:06 | 0 |
|  25/03/2022 09:55:06 | 0.7 |
|  25/03/2022 10:25:06 | 1.6 |
|  25/03/2022 10:55:06 | 0.7 |
|  25/03/2022 11:25:06 | 0.7 |
|  25/03/2022 11:55:06 | 1.6 |
|  25/03/2022 12:25:06 | 0.7 |
|  25/03/2022 12:55:06 | 2.2 |
|  25/03/2022 13:25:06 | 2.2 |
|  25/03/2022 13:55:06 | 5.4 |
|  25/03/2022 14:25:06 | 6.9 |
|  25/03/2022 14:55:06 | 6.9 |
|  25/03/2022 15:25:06 | 7.6 |
|  25/03/2022 15:55:06 | 6 |
|  25/03/2022 16:25:06 | 5.4 |
|  25/03/2022 16:55:06 | 6.9 |
|  25/03/2022 17:25:06 | 6.9 |
|  25/03/2022 17:55:06 | 9.8 |
|  25/03/2022 18:25:06 | 8.3 |
|  25/03/2022 18:55:06 | 6.9 |
|  25/03/2022 19:25:06 | 6.9 |
|  25/03/2022 19:55:06 | 8.3 |
|  25/03/2022 20:25:06 | 4.5 |
|  25/03/2022 20:55:06 | 3.8 |
|  25/03/2022 21:25:06 | 3.8 |
|  25/03/2022 21:55:06 | 4.5 |
|  25/03/2022 22:25:06 | 3.1 |
|  25/03/2022 22:55:06 | 4.5 |
|  25/03/2022 23:25:06 | 3.8 |
|  25/03/2022 23:55:06 | 0.7 |
|  26/03/2022 00:25:06 | 0.7 |
|  26/03/2022 00:55:06 | 0.7 |
|  26/03/2022 01:25:06 | 0.7 |
|  26/03/2022 01:55:06 | 0 |
|  26/03/2022 02:25:06 | 1.6 |
|  26/03/2022 02:55:06 | 0 |
|  26/03/2022 03:25:06 | 2.2 |
|  26/03/2022 03:55:06 | 0 |
|  26/03/2022 04:25:06 | 0 |
|  26/03/2022 04:55:06 | 0 |
|  26/03/2022 05:25:06 | 0 |
|  26/03/2022 05:55:06 | 0 |
|  26/03/2022 06:25:06 | 0.7 |
|  26/03/2022 06:55:06 | 0 |
|  26/03/2022 07:25:06 | 0 |
|  26/03/2022 07:55:06 | 0 |
|  26/03/2022 08:25:06 | 0 |
|  26/03/2022 08:55:06 | 0 |
|  26/03/2022 09:25:06 | 0 |
|  26/03/2022 09:55:06 | 0 |
|  26/03/2022 10:25:06 | 0 |
|  26/03/2022 10:55:06 | 0.7 |
|  26/03/2022 11:25:06 | 0 |
|  26/03/2022 11:55:06 | 0.7 |
|  26/03/2022 12:25:06 | 0 |
|  26/03/2022 12:55:06 | 1.6 |
|  26/03/2022 13:25:06 | 3.8 |
|  26/03/2022 13:55:06 | 0.7 |
|  26/03/2022 14:25:06 | 1.6 |
|  26/03/2022 14:55:06 | 0.7 |
|  26/03/2022 15:25:06 | 4.5 |
|  26/03/2022 15:55:06 | 5.4 |
|  26/03/2022 16:25:06 | 6.9 |
|  26/03/2022 16:55:06 | 8.3 |
|  26/03/2022 17:25:06 | 5.4 |
|  26/03/2022 17:55:06 | 5.4 |
|  26/03/2022 18:25:06 | 3.8 |
|  26/03/2022 18:55:06 | 4.5 |
|  26/03/2022 19:25:06 | 3.1 |
|  26/03/2022 19:55:06 | 3.1 |
|  26/03/2022 20:25:06 | 3.1 |
|  26/03/2022 20:55:06 | 2.2 |
|  26/03/2022 21:25:06 | 2.2 |
|  26/03/2022 21:55:06 | 1.6 |
|  26/03/2022 22:25:06 | 2.2 |
|  26/03/2022 22:55:06 | 2.2 |
|  26/03/2022 23:25:06 | 0 |
|  26/03/2022 23:55:06 | 0 |
|  27/03/2022 00:25:06 | 0.7 |
|  27/03/2022 00:55:06 | 0 |
|  27/03/2022 01:25:06 | 0.7 |
|  27/03/2022 01:55:06 | 0.7 |
|  27/03/2022 02:25:06 | 0.7 |
|  27/03/2022 02:55:06 | 1.6 |
|  27/03/2022 03:25:06 | 0 |
|  27/03/2022 03:55:06 | 0 |
|  27/03/2022 04:25:06 | 0.7 |
|  27/03/2022 04:55:06 | 3.1 |
|  27/03/2022 05:25:06 | 0 |
|  27/03/2022 05:55:06 | 0.7 |
|  27/03/2022 06:25:06 | 0 |
|  27/03/2022 06:55:06 | 3.1 |
|  27/03/2022 07:25:06 | 2.2 |
|  27/03/2022 07:55:06 | 0 |
|  27/03/2022 08:25:06 | 3.1 |
|  27/03/2022 08:55:06 | 1.6 |
|  27/03/2022 09:25:06 | 2.2 |
|  27/03/2022 09:55:06 | 0.7 |
|  27/03/2022 10:25:06 | 1.6 |
|  27/03/2022 10:55:06 | 0.7 |
|  27/03/2022 11:25:06 | 1.6 |
|  27/03/2022 11:55:06 | 0 |
|  27/03/2022 12:25:06 | 3.8 |
|  27/03/2022 12:55:06 | 2.2 |
|  27/03/2022 13:25:06 | 6.9 |
|  27/03/2022 13:55:06 | 3.1 |
|  27/03/2022 14:25:06 | 6.9 |
|  27/03/2022 14:55:06 | 6 |
|  27/03/2022 15:25:06 | 6.9 |
|  27/03/2022 15:55:06 | 3.8 |
|  27/03/2022 16:25:06 | 2.2 |
|  27/03/2022 16:55:06 | 5.4 |
|  27/03/2022 17:25:06 | 3.8 |
|  27/03/2022 17:55:06 | 5.4 |
|  27/03/2022 18:25:06 | 4.5 |
|  27/03/2022 18:55:06 | 3.8 |
|  27/03/2022 19:25:06 | 1.6 |
|  27/03/2022 19:55:06 | 2.2 |
|  27/03/2022 20:25:06 | 1.6 |
|  27/03/2022 20:55:06 | 0.7 |
|  27/03/2022 21:25:06 | 1.6 |
|  27/03/2022 21:55:06 | 0.7 |
|  27/03/2022 22:25:06 | 0 |
|  27/03/2022 22:55:06 | 0 |
|  27/03/2022 23:25:06 | 0 |
|  27/03/2022 23:55:06 | 1.6 |
|  28/03/2022 00:25:06 | 0.7 |
|  28/03/2022 00:55:06 | 0 |
|  28/03/2022 01:25:06 | 0.7 |
|  28/03/2022 01:55:06 | 0 |
|  28/03/2022 02:25:06 | 0 |
|  28/03/2022 02:55:06 | 0 |
|  28/03/2022 03:25:06 | 0 |
|  28/03/2022 03:55:06 | 0 |
|  28/03/2022 04:25:06 | 0 |
|  28/03/2022 04:55:06 | 0 |
|  28/03/2022 05:25:06 | 0.7 |
|  28/03/2022 05:55:06 | 0 |
|  28/03/2022 06:25:06 | 0 |
|  28/03/2022 06:55:06 | 1.6 |
|  28/03/2022 07:25:06 | 0 |
|  28/03/2022 07:55:06 | 0 |
|  28/03/2022 08:25:06 | 0 |
|  28/03/2022 08:55:06 | 0 |
|  28/03/2022 09:25:06 | 0 |
|  28/03/2022 09:55:06 | 1.6 |
|  28/03/2022 10:25:06 | 0 |
|  28/03/2022 10:55:06 | 0.7 |
|  28/03/2022 11:25:06 | 0.7 |
|  28/03/2022 11:55:06 | 3.1 |
|  28/03/2022 12:25:06 | 3.1 |
|  28/03/2022 12:55:06 | 3.1 |
|  28/03/2022 13:25:06 | 3.1 |
|  28/03/2022 13:55:06 | 3.1 |
|  28/03/2022 14:25:06 | 2.2 |
|  28/03/2022 14:55:06 | 2.2 |
|  28/03/2022 15:25:06 | 3.8 |
|  28/03/2022 15:55:06 | 3.1 |
|  28/03/2022 16:25:06 | 3.1 |
|  28/03/2022 16:55:06 | 3.8 |
|  28/03/2022 17:25:06 | 4.5 |
|  28/03/2022 17:55:06 | 3.1 |
|  28/03/2022 18:25:06 | 3.1 |
|  28/03/2022 18:55:06 | 0.7 |
|  28/03/2022 19:25:06 | 0 |
|  28/03/2022 19:55:06 | 0 |
|  28/03/2022 20:25:06 | 0 |
|  28/03/2022 20:55:06 | 0 |
|  28/03/2022 21:25:06 | 0 |
|  28/03/2022 21:55:06 | 0.7 |
|  28/03/2022 22:25:06 | 0.7 |
|  28/03/2022 22:55:06 | 0 |
|  28/03/2022 23:25:06 | 0 |
|  28/03/2022 23:55:06 | 0.7 |
|  29/03/2022 00:25:06 | 0.7 |
|  29/03/2022 00:55:06 | 1.6 |
|  29/03/2022 01:25:06 | 0 |
|  29/03/2022 01:55:06 | 0 |
|  29/03/2022 02:25:06 | 0 |
|  29/03/2022 02:55:06 | 0 |
|  29/03/2022 03:25:06 | 0 |
|  29/03/2022 03:55:06 | 0 |
|  29/03/2022 04:25:06 | 0 |
|  29/03/2022 04:55:06 | 0 |
|  29/03/2022 05:25:06 | 0 |
|  29/03/2022 05:55:06 | 0 |
|  29/03/2022 06:25:06 | 0.7 |
|  29/03/2022 06:55:06 | 0 |
|  29/03/2022 07:25:06 | 0.7 |
|  29/03/2022 07:55:06 | 0 |
|  29/03/2022 08:25:06 | 0 |
|  29/03/2022 08:55:06 | 1.6 |
|  29/03/2022 09:25:06 | 0.7 |
|  29/03/2022 09:55:06 | 1.6 |
|  29/03/2022 10:25:06 | 3.1 |
|  29/03/2022 10:55:06 | 3.1 |
|  29/03/2022 11:25:06 | 2.2 |
|  29/03/2022 11:55:06 | 2.2 |
|  29/03/2022 12:25:06 | 3.1 |
|  29/03/2022 12:55:06 | 3.1 |
|  29/03/2022 13:25:06 | 2.2 |
|  29/03/2022 13:55:06 | 3.1 |
|  29/03/2022 14:25:06 | 2.2 |
|  29/03/2022 14:55:06 | 3.1 |
|  29/03/2022 15:25:06 | 3.8 |
|  29/03/2022 15:55:06 | 3.1 |
|  29/03/2022 16:25:06 | 2.2 |
|  29/03/2022 16:55:06 | 3.8 |
|  29/03/2022 17:25:06 | 5.4 |
|  29/03/2022 17:55:06 | 3.8 |
|  29/03/2022 18:25:06 | 3.8 |
|  29/03/2022 18:55:06 | 3.8 |
|  29/03/2022 19:25:06 | 3.8 |
|  29/03/2022 19:55:06 | 3.8 |
|  29/03/2022 20:25:06 | 3.8 |
|  29/03/2022 20:55:06 | 3.8 |
|  29/03/2022 21:25:06 | 2.2 |
|  29/03/2022 21:55:06 | 2.2 |
|  29/03/2022 22:25:06 | 1.6 |
|  29/03/2022 22:55:06 | 3.1 |
|  29/03/2022 23:25:06 | 2.2 |
|  29/03/2022 23:55:06 | 2.2 |
|  30/03/2022 00:25:06 | 0.7 |
|  30/03/2022 00:55:06 | 0.7 |
|  30/03/2022 01:25:06 | 0 |
|  30/03/2022 01:55:06 | 0 |
|  30/03/2022 02:25:06 | 0.7 |
|  30/03/2022 02:55:06 | 1.6 |
|  30/03/2022 03:25:06 | 2.2 |
|  30/03/2022 03:55:06 | 1.6 |
|  30/03/2022 04:25:06 | 3.1 |
|  30/03/2022 04:55:06 | 4.5 |
|  30/03/2022 05:25:06 | 0.7 |
|  30/03/2022 05:55:06 | 0.7 |
|  30/03/2022 06:25:06 | 3.1 |
|  30/03/2022 06:55:06 | 2.2 |
|  30/03/2022 07:25:06 | 4.5 |
|  30/03/2022 07:55:06 | 4.5 |
|  30/03/2022 08:25:06 | 4.5 |
|  30/03/2022 08:55:06 | 5.4 |
|  30/03/2022 09:25:06 | 3.8 |
|  30/03/2022 09:55:06 | 3.8 |
|  30/03/2022 10:25:06 | 4.5 |
|  30/03/2022 10:55:06 | 2.2 |
|  30/03/2022 11:25:06 | 0.7 |
|  30/03/2022 11:55:06 | 1.6 |
|  30/03/2022 12:25:06 | 1.6 |
|  30/03/2022 12:55:06 | 3.8 |
|  30/03/2022 13:25:06 | 4.5 |
|  30/03/2022 13:55:06 | 1.6 |
|  30/03/2022 14:25:06 | 6.9 |
|  30/03/2022 14:55:06 | 3.1 |
|  30/03/2022 15:25:06 | 4.5 |
|  30/03/2022 15:55:06 | 4.5 |
|  30/03/2022 16:25:06 | 5.4 |
|  30/03/2022 16:55:06 | 2.2 |
|  30/03/2022 17:25:06 | 3.1 |
|  30/03/2022 17:55:06 | 3.1 |
|  30/03/2022 18:25:06 | 3.8 |
|  30/03/2022 18:55:06 | 3.1 |
|  30/03/2022 19:25:06 | 0 |
|  30/03/2022 19:55:06 | 1.6 |
|  30/03/2022 20:25:06 | 0.7 |
|  30/03/2022 20:55:06 | 1.6 |
|  30/03/2022 21:25:06 | 0.7 |
|  30/03/2022 21:55:06 | 1.6 |
|  30/03/2022 22:25:06 | 0 |
|  30/03/2022 22:55:06 | 1.6 |
|  30/03/2022 23:25:06 | 3.1 |
|  30/03/2022 23:55:06 | 0.7 |
|  31/03/2022 00:25:06 | 3.1 |
|  31/03/2022 00:55:06 | 1.6 |
|  31/03/2022 01:25:06 | 2.2 |
|  31/03/2022 01:55:06 | 0.7 |
|  31/03/2022 02:25:06 | 3.1 |
|  31/03/2022 02:55:06 | 0.7 |
|  31/03/2022 03:25:06 | 3.1 |
|  31/03/2022 03:55:06 | 0.7 |
|  31/03/2022 04:25:06 | 2.2 |
|  31/03/2022 04:55:06 | 1.6 |
|  31/03/2022 05:25:06 | 1.6 |
|  31/03/2022 05:55:06 | 0.7 |
|  31/03/2022 06:25:06 | 0 |
|  31/03/2022 06:55:06 | 1.6 |
|  31/03/2022 07:25:06 | 3.1 |
|  31/03/2022 07:55:06 | 1.6 |
|  31/03/2022 08:25:06 | 2.2 |
|  31/03/2022 08:55:06 | 3.1 |
|  31/03/2022 09:25:06 | 3.1 |
|  31/03/2022 09:55:06 | 0.7 |
|  31/03/2022 10:25:06 | 3.1 |
|  31/03/2022 10:55:06 | 0.7 |
|  31/03/2022 11:25:06 | 2.2 |
|  31/03/2022 11:55:06 | 5.4 |
|  31/03/2022 12:25:06 | 3.8 |
|  31/03/2022 12:55:06 | 4.5 |
|  31/03/2022 13:25:06 | 2.2 |
|  31/03/2022 13:55:06 | 5.4 |
|  31/03/2022 14:25:06 | 2.2 |
|  31/03/2022 14:55:06 | 4.5 |
|  31/03/2022 15:25:06 | 3.1 |
|  31/03/2022 15:55:06 | 1.6 |
|  31/03/2022 16:25:06 | 3.1 |
|  31/03/2022 16:55:06 | 3.1 |
|  31/03/2022 17:25:06 | 4.5 |
|  31/03/2022 17:55:06 | 3.1 |
|  31/03/2022 18:25:06 | 3.8 |
|  31/03/2022 18:55:06 | 1.6 |
|  31/03/2022 19:25:06 | 3.8 |
|  31/03/2022 19:55:06 | 0.7 |
|  31/03/2022 20:25:06 | 2.2 |
|  31/03/2022 20:55:06 | 3.8 |
|  31/03/2022 21:25:06 | 1.6 |
|  31/03/2022 21:55:06 | 0.7 |
|  31/03/2022 22:25:06 | 1.6 |
|  31/03/2022 22:55:06 | 3.1 |
|  31/03/2022 23:25:06 | 1.6 |
|  31/03/2022 23:55:06 | 3.1 |